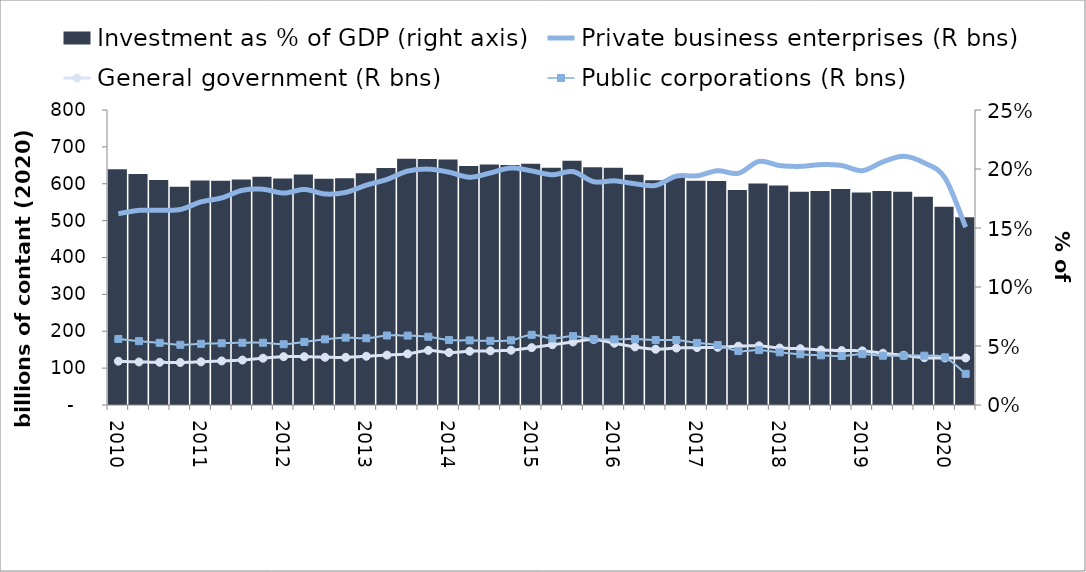
| Category | Investment as % of GDP (right axis) |
|---|---|
| 2010.0 | 0.2 |
| nan | 0.196 |
| nan | 0.191 |
| nan | 0.185 |
| 2011.0 | 0.19 |
| nan | 0.19 |
| nan | 0.191 |
| nan | 0.193 |
| 2012.0 | 0.192 |
| nan | 0.195 |
| nan | 0.192 |
| nan | 0.192 |
| 2013.0 | 0.196 |
| nan | 0.201 |
| nan | 0.209 |
| nan | 0.209 |
| 2014.0 | 0.208 |
| nan | 0.203 |
| nan | 0.204 |
| nan | 0.203 |
| 2015.0 | 0.204 |
| nan | 0.201 |
| nan | 0.207 |
| nan | 0.201 |
| 2016.0 | 0.201 |
| nan | 0.195 |
| nan | 0.19 |
| nan | 0.192 |
| 2017.0 | 0.19 |
| nan | 0.19 |
| nan | 0.182 |
| nan | 0.188 |
| 2018.0 | 0.186 |
| nan | 0.181 |
| nan | 0.181 |
| nan | 0.183 |
| 2019.0 | 0.18 |
| nan | 0.181 |
| nan | 0.181 |
| nan | 0.177 |
| 2020.0 | 0.168 |
| nan | 0.159 |